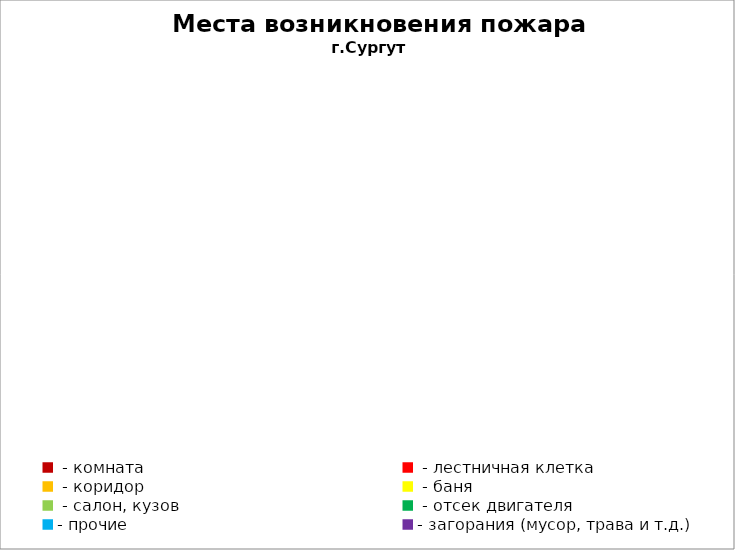
| Category | Места возникновения пожара |
|---|---|
|  - комната | 47 |
|  - лестничная клетка | 10 |
|  - коридор | 7 |
|  - баня | 46 |
|  - салон, кузов | 24 |
|  - отсек двигателя | 34 |
| - прочие | 112 |
| - загорания (мусор, трава и т.д.)  | 112 |